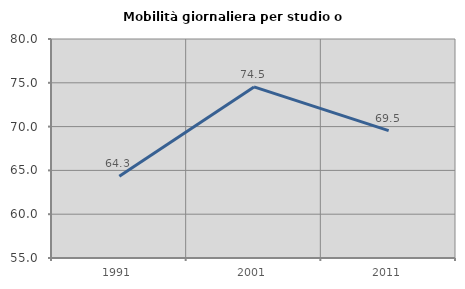
| Category | Mobilità giornaliera per studio o lavoro |
|---|---|
| 1991.0 | 64.331 |
| 2001.0 | 74.533 |
| 2011.0 | 69.545 |